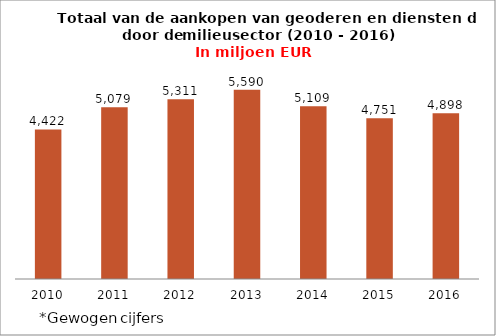
| Category | Totaal van de aankopen van goederen en diensten |
|---|---|
| 2010 | 4421.663 |
| 2011 | 5079.278 |
| 2012 | 5311.482 |
| 2013 | 5590.179 |
| 2014 | 5108.615 |
| 2015 | 4751.181 |
| 2016 | 4898.013 |